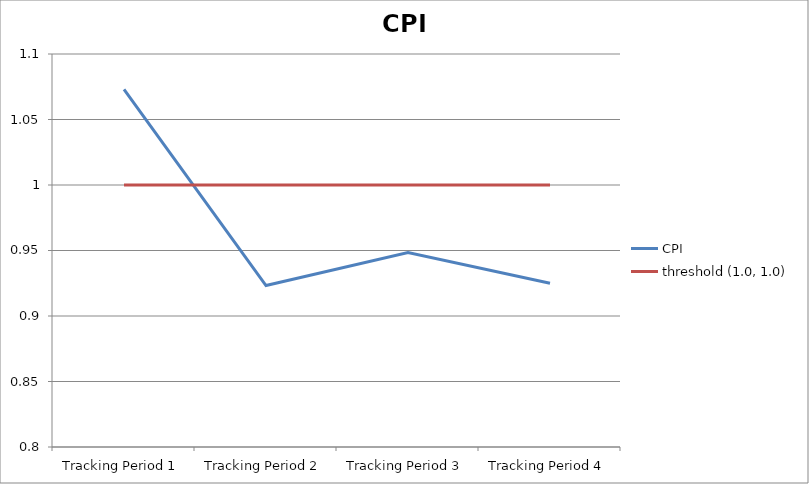
| Category | CPI | threshold (1.0, 1.0) |
|---|---|---|
| Tracking Period 1 | 1.073 | 1 |
| Tracking Period 2 | 0.923 | 1 |
| Tracking Period 3 | 0.949 | 1 |
| Tracking Period 4 | 0.925 | 1 |